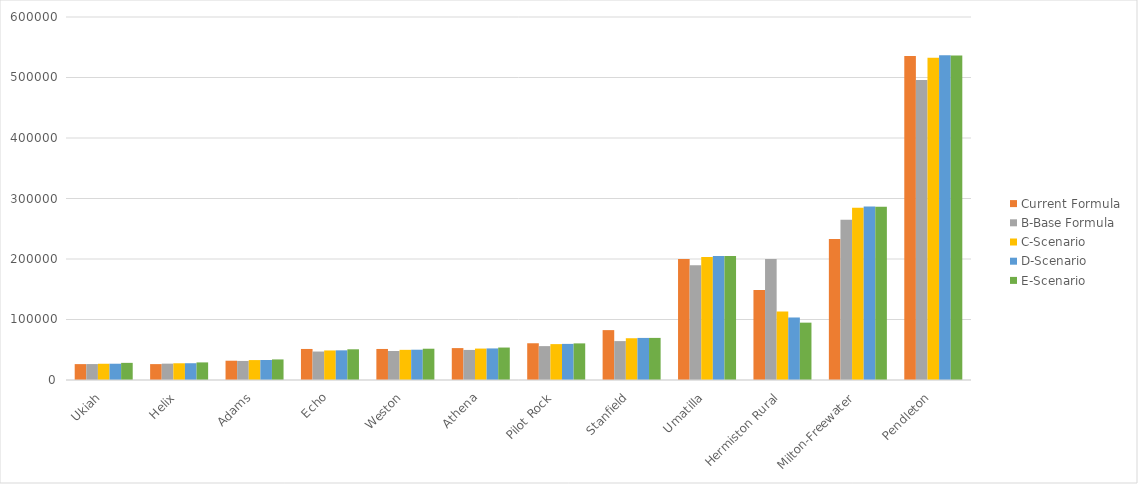
| Category | Current Formula | B-Base Formula  | C-Scenario | D-Scenario | E-Scenario |
|---|---|---|---|---|---|
| Ukiah | 26265 | 26339.993 | 26847.395 | 26904.928 | 28328.398 |
| Helix | 26265 | 27030.501 | 27655.634 | 27726.516 | 29082.111 |
| Adams | 31885.699 | 31533.393 | 32926.26 | 33084.194 | 33997.17 |
| Echo | 51300.646 | 47057.552 | 48838.433 | 49040.363 | 50759.239 |
| Weston | 51300.646 | 47923.119 | 49851.577 | 50070.241 | 51704.034 |
| Athena | 52733.508 | 49702.88 | 51934.784 | 52187.854 | 53646.704 |
| Pilot Rock | 60735.391 | 56004.983 | 59311.385 | 59686.29 | 60525.663 |
| Stanfield | 82444.301 | 64300.807 | 69021.633 | 69556.916 | 69580.837 |
| Umatilla | 199898.911 | 189480.549 | 203507.057 | 205097.489 | 204931.847 |
| Hermiston Rural | 148764.394 | 200012.213 | 113171.895 | 103325.276 | 94789.159 |
| Milton-Freewater | 233095.644 | 264900.93 | 284510.515 | 286734 | 286502.426 |
| Pendleton | 535508.629 | 495910.848 | 532621.199 | 536783.7 | 536350.179 |